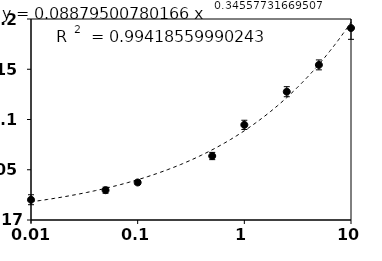
| Category | Series 0 |
|---|---|
| 25.0 | 0.281 |
| 10.0 | 0.191 |
| 5.0 | 0.154 |
| 2.5 | 0.128 |
| 1.0 | 0.095 |
| 0.5 | 0.064 |
| 0.1 | 0.037 |
| 0.05 | 0.03 |
| 0.01 | 0.02 |